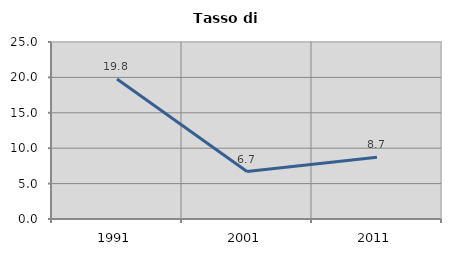
| Category | Tasso di disoccupazione   |
|---|---|
| 1991.0 | 19.782 |
| 2001.0 | 6.697 |
| 2011.0 | 8.716 |